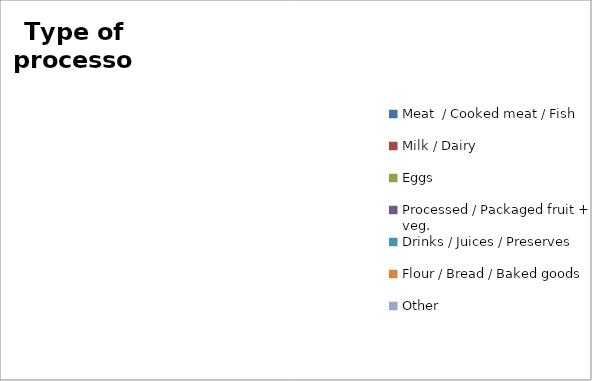
| Category | Series 0 |
|---|---|
| Meat  / Cooked meat / Fish | 0 |
| Milk / Dairy | 0 |
| Eggs | 0 |
| Processed / Packaged fruit + veg. | 0 |
| Drinks / Juices / Preserves | 0 |
| Flour / Bread / Baked goods | 0 |
| Other | 0 |